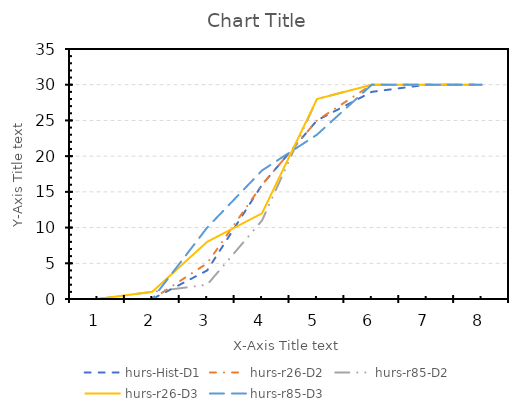
| Category | hurs-Hist-D1 | hurs-r26-D2 | hurs-r85-D2 | hurs-r26-D3 | hurs-r85-D3 |
|---|---|---|---|---|---|
| 0 | 0 | 0 | 0 | 0 | 0 |
| 1 | 0 | 0 | 1 | 1 | 0 |
| 2 | 4 | 5 | 2 | 8 | 10 |
| 3 | 16 | 16 | 11 | 12 | 18 |
| 4 | 25 | 25 | 28 | 28 | 23 |
| 5 | 29 | 30 | 30 | 30 | 30 |
| 6 | 30 | 30 | 30 | 30 | 30 |
| 7 | 30 | 30 | 30 | 30 | 30 |